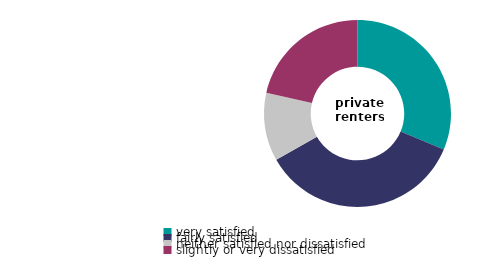
| Category | private renters |
|---|---|
| very satisfied | 31.299 |
| fairly satisfied | 35.461 |
| neither satisfied nor dissatisfied | 11.822 |
| slightly or very dissatisfied | 21.417 |